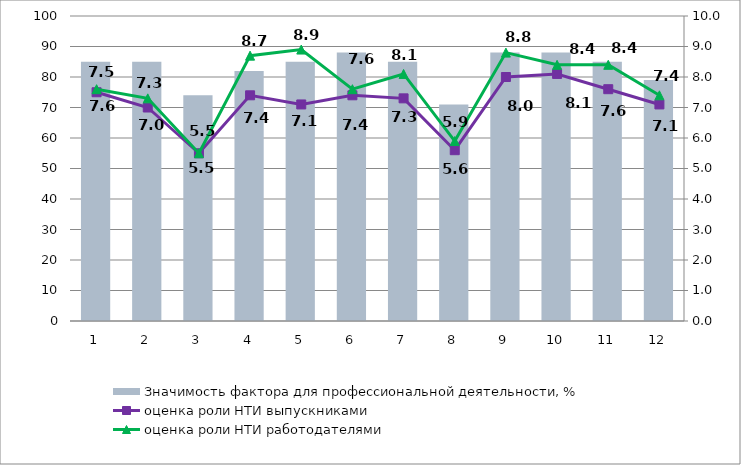
| Category | Значимость фактора для профессиональной деятельности, % |
|---|---|
| 1.0 | 85 |
| 2.0 | 85 |
| 3.0 | 74 |
| 4.0 | 82 |
| 5.0 | 85 |
| 6.0 | 88 |
| 7.0 | 85 |
| 8.0 | 71 |
| 9.0 | 88 |
| 10.0 | 88 |
| 11.0 | 85 |
| 12.0 | 79 |